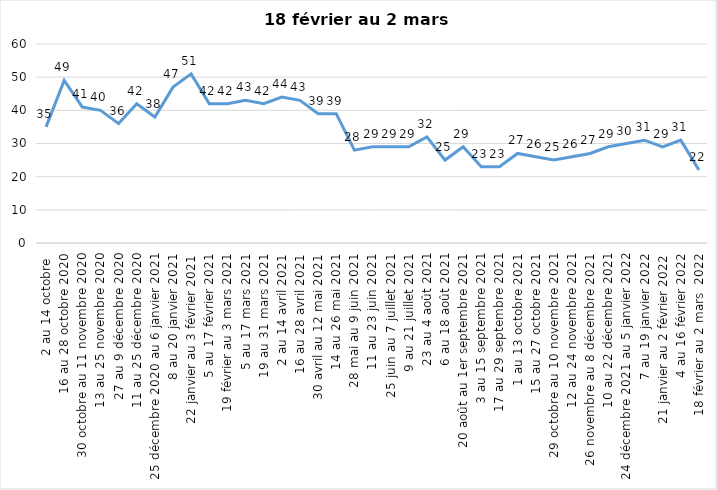
| Category | Toujours aux trois mesures |
|---|---|
| 2 au 14 octobre  | 35 |
| 16 au 28 octobre 2020 | 49 |
| 30 octobre au 11 novembre 2020 | 41 |
| 13 au 25 novembre 2020 | 40 |
| 27 au 9 décembre 2020 | 36 |
| 11 au 25 décembre 2020 | 42 |
| 25 décembre 2020 au 6 janvier 2021 | 38 |
| 8 au 20 janvier 2021 | 47 |
| 22 janvier au 3 février 2021 | 51 |
| 5 au 17 février 2021 | 42 |
| 19 février au 3 mars 2021 | 42 |
| 5 au 17 mars 2021 | 43 |
| 19 au 31 mars 2021 | 42 |
| 2 au 14 avril 2021 | 44 |
| 16 au 28 avril 2021 | 43 |
| 30 avril au 12 mai 2021 | 39 |
| 14 au 26 mai 2021 | 39 |
| 28 mai au 9 juin 2021 | 28 |
| 11 au 23 juin 2021 | 29 |
| 25 juin au 7 juillet 2021 | 29 |
| 9 au 21 juillet 2021 | 29 |
| 23 au 4 août 2021 | 32 |
| 6 au 18 août 2021 | 25 |
| 20 août au 1er septembre 2021 | 29 |
| 3 au 15 septembre 2021 | 23 |
| 17 au 29 septembre 2021 | 23 |
| 1 au 13 octobre 2021 | 27 |
| 15 au 27 octobre 2021 | 26 |
| 29 octobre au 10 novembre 2021 | 25 |
| 12 au 24 novembre 2021 | 26 |
| 26 novembre au 8 décembre 2021 | 27 |
| 10 au 22 décembre 2021 | 29 |
| 24 décembre 2021 au 5 janvier 2022 | 30 |
| 7 au 19 janvier 2022 | 31 |
| 21 janvier au 2 février 2022 | 29 |
| 4 au 16 février 2022 | 31 |
| 18 février au 2 mars  2022 | 22 |